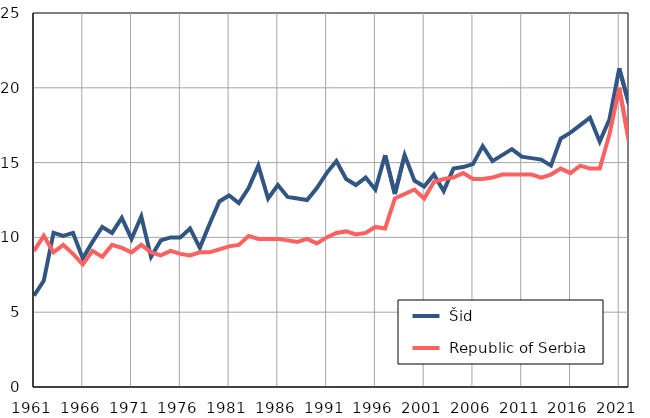
| Category |  Šid |  Republic of Serbia |
|---|---|---|
| 1961.0 | 6.1 | 9.1 |
| 1962.0 | 7.1 | 10.1 |
| 1963.0 | 10.3 | 9 |
| 1964.0 | 10.1 | 9.5 |
| 1965.0 | 10.3 | 8.9 |
| 1966.0 | 8.6 | 8.2 |
| 1967.0 | 9.7 | 9.1 |
| 1968.0 | 10.7 | 8.7 |
| 1969.0 | 10.3 | 9.5 |
| 1970.0 | 11.3 | 9.3 |
| 1971.0 | 9.9 | 9 |
| 1972.0 | 11.4 | 9.5 |
| 1973.0 | 8.7 | 9 |
| 1974.0 | 9.8 | 8.8 |
| 1975.0 | 10 | 9.1 |
| 1976.0 | 10 | 8.9 |
| 1977.0 | 10.6 | 8.8 |
| 1978.0 | 9.3 | 9 |
| 1979.0 | 10.9 | 9 |
| 1980.0 | 12.4 | 9.2 |
| 1981.0 | 12.8 | 9.4 |
| 1982.0 | 12.3 | 9.5 |
| 1983.0 | 13.3 | 10.1 |
| 1984.0 | 14.8 | 9.9 |
| 1985.0 | 12.6 | 9.9 |
| 1986.0 | 13.5 | 9.9 |
| 1987.0 | 12.7 | 9.8 |
| 1988.0 | 12.6 | 9.7 |
| 1989.0 | 12.5 | 9.9 |
| 1990.0 | 13.3 | 9.6 |
| 1991.0 | 14.3 | 10 |
| 1992.0 | 15.1 | 10.3 |
| 1993.0 | 13.9 | 10.4 |
| 1994.0 | 13.5 | 10.2 |
| 1995.0 | 14 | 10.3 |
| 1996.0 | 13.2 | 10.7 |
| 1997.0 | 15.5 | 10.6 |
| 1998.0 | 12.9 | 12.6 |
| 1999.0 | 15.5 | 12.9 |
| 2000.0 | 13.8 | 13.2 |
| 2001.0 | 13.4 | 12.6 |
| 2002.0 | 14.2 | 13.7 |
| 2003.0 | 13.1 | 13.9 |
| 2004.0 | 14.6 | 14 |
| 2005.0 | 14.7 | 14.3 |
| 2006.0 | 14.9 | 13.9 |
| 2007.0 | 16.1 | 13.9 |
| 2008.0 | 15.1 | 14 |
| 2009.0 | 15.5 | 14.2 |
| 2010.0 | 15.9 | 14.2 |
| 2011.0 | 15.4 | 14.2 |
| 2012.0 | 15.3 | 14.2 |
| 2013.0 | 15.2 | 14 |
| 2014.0 | 14.8 | 14.2 |
| 2015.0 | 16.6 | 14.6 |
| 2016.0 | 17 | 14.3 |
| 2017.0 | 17.5 | 14.8 |
| 2018.0 | 18 | 14.6 |
| 2019.0 | 16.4 | 14.6 |
| 2020.0 | 17.9 | 16.9 |
| 2021.0 | 21.3 | 20 |
| 2022.0 | 18.9 | 16.4 |